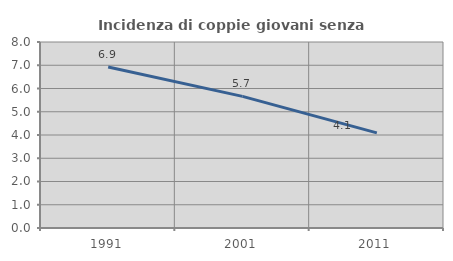
| Category | Incidenza di coppie giovani senza figli |
|---|---|
| 1991.0 | 6.928 |
| 2001.0 | 5.66 |
| 2011.0 | 4.091 |